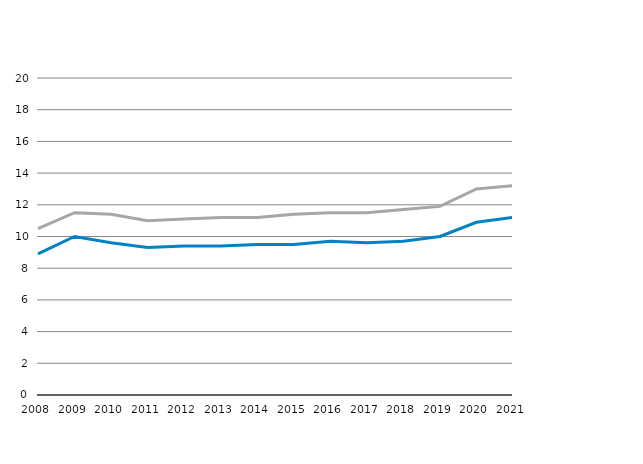
| Category | % des BIP in jeweiligen Preisen - Deutschland | % des BIP in jeweiligen Preisen |
|---|---|---|
| 2008 | 10.5 | 8.9 |
| 2009 | 11.5 | 10 |
| 2010 | 11.4 | 9.6 |
| 2011 | 11 | 9.3 |
| 2012 | 11.1 | 9.4 |
| 2013 | 11.2 | 9.4 |
| 2014 | 11.2 | 9.5 |
| 2015 | 11.4 | 9.5 |
| 2016 | 11.5 | 9.7 |
| 2017 | 11.5 | 9.6 |
| 2018 | 11.7 | 9.7 |
| 2019 | 11.9 | 10 |
| 2020 | 13 | 10.9 |
| 2021 | 13.2 | 11.2 |